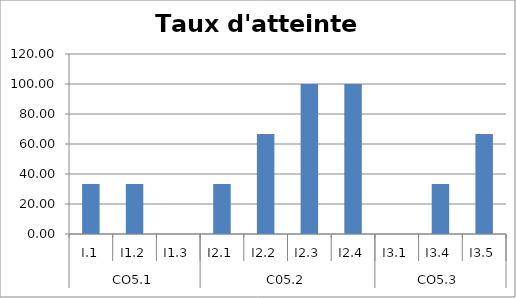
| Category | Taux d'atteeinte % |
|---|---|
| 0 | 33.333 |
| 1 | 33.333 |
| 2 | 0 |
| 3 | 33.333 |
| 4 | 66.666 |
| 5 | 100 |
| 6 | 100 |
| 7 | 0 |
| 8 | 33.333 |
| 9 | 66.666 |